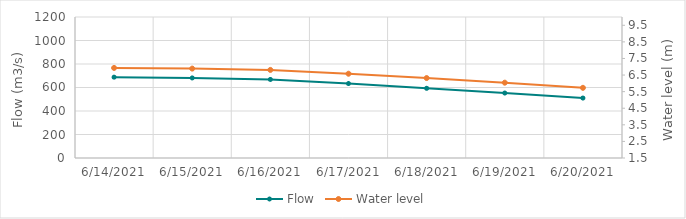
| Category | Flow |
|---|---|
| 6/6/21 | 723.29 |
| 6/5/21 | 742.76 |
| 6/4/21 | 786.92 |
| 6/3/21 | 815.66 |
| 6/2/21 | 837.87 |
| 6/1/21 | 846.58 |
| 5/31/21 | 835.99 |